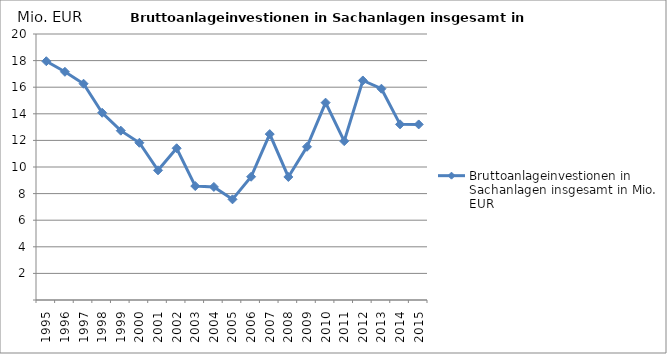
| Category | Bruttoanlageinvestionen in Sachanlagen insgesamt in Mio. EUR |
|---|---|
| 1995.0 | 17.953 |
| 1996.0 | 17.158 |
| 1997.0 | 16.261 |
| 1998.0 | 14.078 |
| 1999.0 | 12.731 |
| 2000.0 | 11.822 |
| 2001.0 | 9.752 |
| 2002.0 | 11.408 |
| 2003.0 | 8.567 |
| 2004.0 | 8.502 |
| 2005.0 | 7.569 |
| 2006.0 | 9.268 |
| 2007.0 | 12.474 |
| 2008.0 | 9.251 |
| 2009.0 | 11.52 |
| 2010.0 | 14.838 |
| 2011.0 | 11.944 |
| 2012.0 | 16.506 |
| 2013.0 | 15.886 |
| 2014.0 | 13.207 |
| 2015.0 | 13.201 |